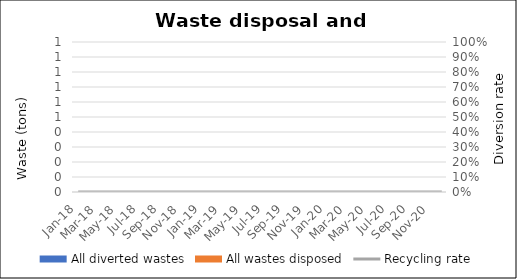
| Category | Recycling rate |
|---|---|
| Jan-18 | 0 |
| Feb-18 | 0 |
| Mar-18 | 0 |
| Apr-18 | 0 |
| May-18 | 0 |
| Jun-18 | 0 |
| Jul-18 | 0 |
| Aug-18 | 0 |
| Sep-18 | 0 |
| Oct-18 | 0 |
| Nov-18 | 0 |
| Dec-18 | 0 |
| Jan-19 | 0 |
| Feb-19 | 0 |
| Mar-19 | 0 |
| Apr-19 | 0 |
| May-19 | 0 |
| Jun-19 | 0 |
| Jul-19 | 0 |
| Aug-19 | 0 |
| Sep-19 | 0 |
| Oct-19 | 0 |
| Nov-19 | 0 |
| Dec-19 | 0 |
| Jan-20 | 0 |
| Feb-20 | 0 |
| Mar-20 | 0 |
| Apr-20 | 0 |
| May-20 | 0 |
| Jun-20 | 0 |
| Jul-20 | 0 |
| Aug-20 | 0 |
| Sep-20 | 0 |
| Oct-20 | 0 |
| Nov-20 | 0 |
| Dec-20 | 0 |